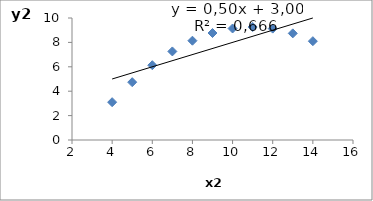
| Category | y2 |
|---|---|
| 10.0 | 9.14 |
| 8.0 | 8.14 |
| 13.0 | 8.74 |
| 9.0 | 8.77 |
| 11.0 | 9.26 |
| 14.0 | 8.1 |
| 6.0 | 6.13 |
| 4.0 | 3.1 |
| 12.0 | 9.13 |
| 7.0 | 7.26 |
| 5.0 | 4.74 |